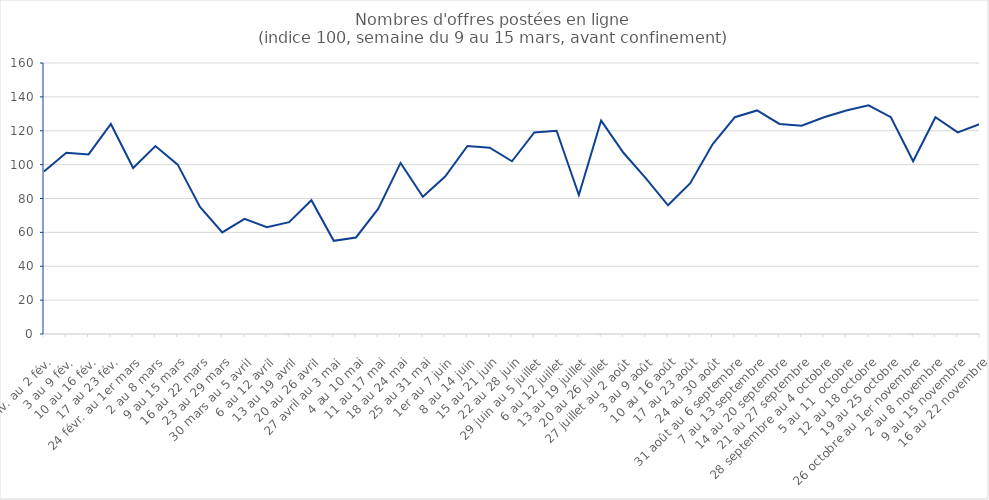
| Category | Series 0 |
|---|---|
| 27 janv. au 2 fév. | 96 |
| 3 au 9 fév. | 107 |
| 10 au 16 fév. | 106 |
| 17 au 23 fév. | 124 |
| 24 févr. au 1er mars | 98 |
| 2 au 8 mars | 111 |
| 9 au 15 mars | 100 |
| 16 au 22 mars | 75 |
| 23 au 29 mars | 60 |
| 30 mars au 5 avril | 68 |
| 6 au 12 avril | 63 |
| 13 au 19 avril | 66 |
| 20 au 26 avril | 79 |
| 27 avril au 3 mai | 55 |
| 4 au 10 mai | 57 |
| 11 au 17 mai | 74 |
| 18 au 24 mai | 101 |
| 25 au 31 mai | 81 |
| 1er au 7 juin | 93 |
| 8 au 14 juin | 111 |
| 15 au 21 juin | 110 |
| 22 au 28 juin | 102 |
| 29 juin au 5 juillet | 119 |
| 6 au 12 juillet | 120 |
| 13 au 19 juillet | 82 |
| 20 au 26 juillet | 126 |
| 27 juillet au 2 août | 107 |
| 3 au 9 août | 92 |
| 10 au 16 août | 76 |
| 17 au 23 août | 89 |
| 24 au 30 août | 112 |
| 31 août au 6 septembre | 128 |
| 7 au 13 septembre | 132 |
| 14 au 20 septembre | 124 |
| 21 au 27 septembre | 123 |
| 28 septembre au 4 octobre | 128 |
| 5 au 11  octobre | 132 |
| 12 au 18 octobre | 135 |
| 19 au 25 octobre | 128 |
| 26 octobre au 1er novembre | 102 |
| 2 au 8 novembre | 128 |
| 9 au 15 novembre | 119 |
| 16 au 22 novembre | 124 |